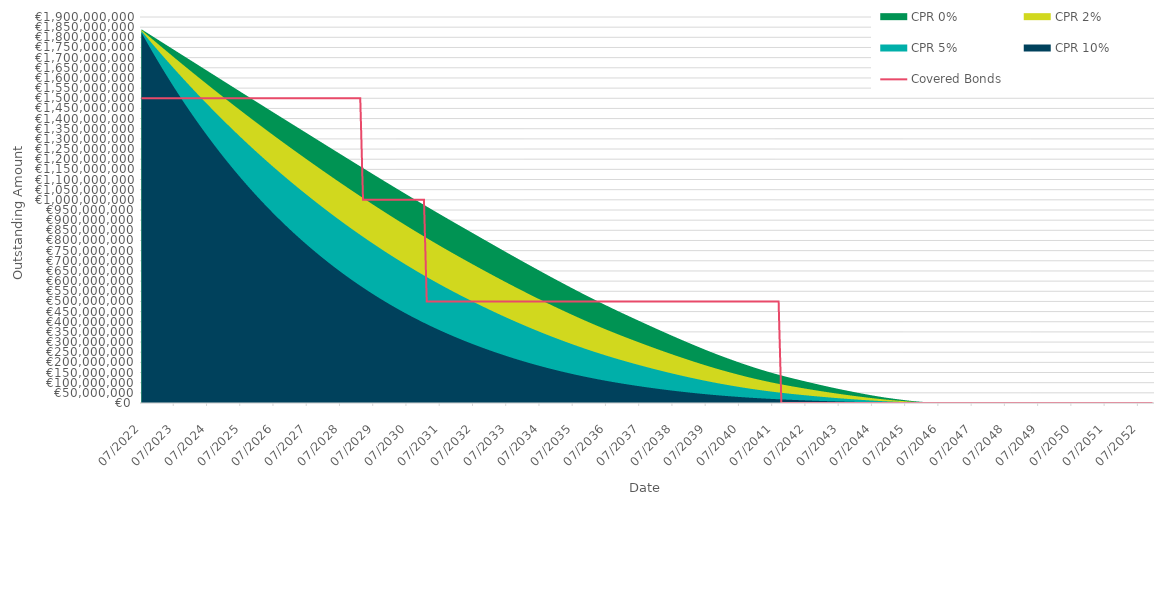
| Category | Covered Bonds |
|---|---|
| 2022-07-31 | 1500000000 |
| 2022-08-31 | 1500000000 |
| 2022-09-30 | 1500000000 |
| 2022-10-31 | 1500000000 |
| 2022-11-30 | 1500000000 |
| 2022-12-31 | 1500000000 |
| 2023-01-31 | 1500000000 |
| 2023-02-28 | 1500000000 |
| 2023-03-31 | 1500000000 |
| 2023-04-30 | 1500000000 |
| 2023-05-31 | 1500000000 |
| 2023-06-30 | 1500000000 |
| 2023-07-31 | 1500000000 |
| 2023-08-31 | 1500000000 |
| 2023-09-30 | 1500000000 |
| 2023-10-31 | 1500000000 |
| 2023-11-30 | 1500000000 |
| 2023-12-31 | 1500000000 |
| 2024-01-31 | 1500000000 |
| 2024-02-29 | 1500000000 |
| 2024-03-31 | 1500000000 |
| 2024-04-30 | 1500000000 |
| 2024-05-31 | 1500000000 |
| 2024-06-30 | 1500000000 |
| 2024-07-31 | 1500000000 |
| 2024-08-31 | 1500000000 |
| 2024-09-30 | 1500000000 |
| 2024-10-31 | 1500000000 |
| 2024-11-30 | 1500000000 |
| 2024-12-31 | 1500000000 |
| 2025-01-31 | 1500000000 |
| 2025-02-28 | 1500000000 |
| 2025-03-31 | 1500000000 |
| 2025-04-30 | 1500000000 |
| 2025-05-31 | 1500000000 |
| 2025-06-30 | 1500000000 |
| 2025-07-31 | 1500000000 |
| 2025-08-31 | 1500000000 |
| 2025-09-30 | 1500000000 |
| 2025-10-31 | 1500000000 |
| 2025-11-30 | 1500000000 |
| 2025-12-31 | 1500000000 |
| 2026-01-31 | 1500000000 |
| 2026-02-28 | 1500000000 |
| 2026-03-31 | 1500000000 |
| 2026-04-30 | 1500000000 |
| 2026-05-31 | 1500000000 |
| 2026-06-30 | 1500000000 |
| 2026-07-31 | 1500000000 |
| 2026-08-31 | 1500000000 |
| 2026-09-30 | 1500000000 |
| 2026-10-31 | 1500000000 |
| 2026-11-30 | 1500000000 |
| 2026-12-31 | 1500000000 |
| 2027-01-31 | 1500000000 |
| 2027-02-28 | 1500000000 |
| 2027-03-31 | 1500000000 |
| 2027-04-30 | 1500000000 |
| 2027-05-31 | 1500000000 |
| 2027-06-30 | 1500000000 |
| 2027-07-31 | 1500000000 |
| 2027-08-31 | 1500000000 |
| 2027-09-30 | 1500000000 |
| 2027-10-31 | 1500000000 |
| 2027-11-30 | 1500000000 |
| 2027-12-31 | 1500000000 |
| 2028-01-31 | 1500000000 |
| 2028-02-29 | 1500000000 |
| 2028-03-31 | 1500000000 |
| 2028-04-30 | 1500000000 |
| 2028-05-31 | 1500000000 |
| 2028-06-30 | 1500000000 |
| 2028-07-31 | 1500000000 |
| 2028-08-31 | 1500000000 |
| 2028-09-30 | 1500000000 |
| 2028-10-31 | 1500000000 |
| 2028-11-30 | 1500000000 |
| 2028-12-31 | 1500000000 |
| 2029-01-31 | 1500000000 |
| 2029-02-28 | 1500000000 |
| 2029-03-31 | 1000000000 |
| 2029-04-30 | 1000000000 |
| 2029-05-31 | 1000000000 |
| 2029-06-30 | 1000000000 |
| 2029-07-31 | 1000000000 |
| 2029-08-31 | 1000000000 |
| 2029-09-30 | 1000000000 |
| 2029-10-31 | 1000000000 |
| 2029-11-30 | 1000000000 |
| 2029-12-31 | 1000000000 |
| 2030-01-31 | 1000000000 |
| 2030-02-28 | 1000000000 |
| 2030-03-31 | 1000000000 |
| 2030-04-30 | 1000000000 |
| 2030-05-31 | 1000000000 |
| 2030-06-30 | 1000000000 |
| 2030-07-31 | 1000000000 |
| 2030-08-31 | 1000000000 |
| 2030-09-30 | 1000000000 |
| 2030-10-31 | 1000000000 |
| 2030-11-30 | 1000000000 |
| 2030-12-31 | 1000000000 |
| 2031-01-31 | 1000000000 |
| 2031-02-28 | 500000000 |
| 2031-03-31 | 500000000 |
| 2031-04-30 | 500000000 |
| 2031-05-31 | 500000000 |
| 2031-06-30 | 500000000 |
| 2031-07-31 | 500000000 |
| 2031-08-31 | 500000000 |
| 2031-09-30 | 500000000 |
| 2031-10-31 | 500000000 |
| 2031-11-30 | 500000000 |
| 2031-12-31 | 500000000 |
| 2032-01-31 | 500000000 |
| 2032-02-29 | 500000000 |
| 2032-03-31 | 500000000 |
| 2032-04-30 | 500000000 |
| 2032-05-31 | 500000000 |
| 2032-06-30 | 500000000 |
| 2032-07-31 | 500000000 |
| 2032-08-31 | 500000000 |
| 2032-09-30 | 500000000 |
| 2032-10-31 | 500000000 |
| 2032-11-30 | 500000000 |
| 2032-12-31 | 500000000 |
| 2033-01-31 | 500000000 |
| 2033-02-28 | 500000000 |
| 2033-03-31 | 500000000 |
| 2033-04-30 | 500000000 |
| 2033-05-31 | 500000000 |
| 2033-06-30 | 500000000 |
| 2033-07-31 | 500000000 |
| 2033-08-31 | 500000000 |
| 2033-09-30 | 500000000 |
| 2033-10-31 | 500000000 |
| 2033-11-30 | 500000000 |
| 2033-12-31 | 500000000 |
| 2034-01-31 | 500000000 |
| 2034-02-28 | 500000000 |
| 2034-03-31 | 500000000 |
| 2034-04-30 | 500000000 |
| 2034-05-31 | 500000000 |
| 2034-06-30 | 500000000 |
| 2034-07-31 | 500000000 |
| 2034-08-31 | 500000000 |
| 2034-09-30 | 500000000 |
| 2034-10-31 | 500000000 |
| 2034-11-30 | 500000000 |
| 2034-12-31 | 500000000 |
| 2035-01-31 | 500000000 |
| 2035-02-28 | 500000000 |
| 2035-03-31 | 500000000 |
| 2035-04-30 | 500000000 |
| 2035-05-31 | 500000000 |
| 2035-06-30 | 500000000 |
| 2035-07-31 | 500000000 |
| 2035-08-31 | 500000000 |
| 2035-09-30 | 500000000 |
| 2035-10-31 | 500000000 |
| 2035-11-30 | 500000000 |
| 2035-12-31 | 500000000 |
| 2036-01-31 | 500000000 |
| 2036-02-29 | 500000000 |
| 2036-03-31 | 500000000 |
| 2036-04-30 | 500000000 |
| 2036-05-31 | 500000000 |
| 2036-06-30 | 500000000 |
| 2036-07-31 | 500000000 |
| 2036-08-31 | 500000000 |
| 2036-09-30 | 500000000 |
| 2036-10-31 | 500000000 |
| 2036-11-30 | 500000000 |
| 2036-12-31 | 500000000 |
| 2037-01-31 | 500000000 |
| 2037-02-28 | 500000000 |
| 2037-03-31 | 500000000 |
| 2037-04-30 | 500000000 |
| 2037-05-31 | 500000000 |
| 2037-06-30 | 500000000 |
| 2037-07-31 | 500000000 |
| 2037-08-31 | 500000000 |
| 2037-09-30 | 500000000 |
| 2037-10-31 | 500000000 |
| 2037-11-30 | 500000000 |
| 2037-12-31 | 500000000 |
| 2038-01-31 | 500000000 |
| 2038-02-28 | 500000000 |
| 2038-03-31 | 500000000 |
| 2038-04-30 | 500000000 |
| 2038-05-31 | 500000000 |
| 2038-06-30 | 500000000 |
| 2038-07-31 | 500000000 |
| 2038-08-31 | 500000000 |
| 2038-09-30 | 500000000 |
| 2038-10-31 | 500000000 |
| 2038-11-30 | 500000000 |
| 2038-12-31 | 500000000 |
| 2039-01-31 | 500000000 |
| 2039-02-28 | 500000000 |
| 2039-03-31 | 500000000 |
| 2039-04-30 | 500000000 |
| 2039-05-31 | 500000000 |
| 2039-06-30 | 500000000 |
| 2039-07-31 | 500000000 |
| 2039-08-31 | 500000000 |
| 2039-09-30 | 500000000 |
| 2039-10-31 | 500000000 |
| 2039-11-30 | 500000000 |
| 2039-12-31 | 500000000 |
| 2040-01-31 | 500000000 |
| 2040-02-29 | 500000000 |
| 2040-03-31 | 500000000 |
| 2040-04-30 | 500000000 |
| 2040-05-31 | 500000000 |
| 2040-06-30 | 500000000 |
| 2040-07-31 | 500000000 |
| 2040-08-31 | 500000000 |
| 2040-09-30 | 500000000 |
| 2040-10-31 | 500000000 |
| 2040-11-30 | 500000000 |
| 2040-12-31 | 500000000 |
| 2041-01-31 | 500000000 |
| 2041-02-28 | 500000000 |
| 2041-03-31 | 500000000 |
| 2041-04-30 | 500000000 |
| 2041-05-31 | 500000000 |
| 2041-06-30 | 500000000 |
| 2041-07-31 | 500000000 |
| 2041-08-31 | 500000000 |
| 2041-09-30 | 500000000 |
| 2041-10-31 | 0 |
| 2041-11-30 | 0 |
| 2041-12-31 | 0 |
| 2042-01-31 | 0 |
| 2042-02-28 | 0 |
| 2042-03-31 | 0 |
| 2042-04-30 | 0 |
| 2042-05-31 | 0 |
| 2042-06-30 | 0 |
| 2042-07-31 | 0 |
| 2042-08-31 | 0 |
| 2042-09-30 | 0 |
| 2042-10-31 | 0 |
| 2042-11-30 | 0 |
| 2042-12-31 | 0 |
| 2043-01-31 | 0 |
| 2043-02-28 | 0 |
| 2043-03-31 | 0 |
| 2043-04-30 | 0 |
| 2043-05-31 | 0 |
| 2043-06-30 | 0 |
| 2043-07-31 | 0 |
| 2043-08-31 | 0 |
| 2043-09-30 | 0 |
| 2043-10-31 | 0 |
| 2043-11-30 | 0 |
| 2043-12-31 | 0 |
| 2044-01-31 | 0 |
| 2044-02-29 | 0 |
| 2044-03-31 | 0 |
| 2044-04-30 | 0 |
| 2044-05-31 | 0 |
| 2044-06-30 | 0 |
| 2044-07-31 | 0 |
| 2044-08-31 | 0 |
| 2044-09-30 | 0 |
| 2044-10-31 | 0 |
| 2044-11-30 | 0 |
| 2044-12-31 | 0 |
| 2045-01-31 | 0 |
| 2045-02-28 | 0 |
| 2045-03-31 | 0 |
| 2045-04-30 | 0 |
| 2045-05-31 | 0 |
| 2045-06-30 | 0 |
| 2045-07-31 | 0 |
| 2045-08-31 | 0 |
| 2045-09-30 | 0 |
| 2045-10-31 | 0 |
| 2045-11-30 | 0 |
| 2045-12-31 | 0 |
| 2046-01-31 | 0 |
| 2046-02-28 | 0 |
| 2046-03-31 | 0 |
| 2046-04-30 | 0 |
| 2046-05-31 | 0 |
| 2046-06-30 | 0 |
| 2046-07-31 | 0 |
| 2046-08-31 | 0 |
| 2046-09-30 | 0 |
| 2046-10-31 | 0 |
| 2046-11-30 | 0 |
| 2046-12-31 | 0 |
| 2047-01-31 | 0 |
| 2047-02-28 | 0 |
| 2047-03-31 | 0 |
| 2047-04-30 | 0 |
| 2047-05-31 | 0 |
| 2047-06-30 | 0 |
| 2047-07-31 | 0 |
| 2047-08-31 | 0 |
| 2047-09-30 | 0 |
| 2047-10-31 | 0 |
| 2047-11-30 | 0 |
| 2047-12-31 | 0 |
| 2048-01-31 | 0 |
| 2048-02-29 | 0 |
| 2048-03-31 | 0 |
| 2048-04-30 | 0 |
| 2048-05-31 | 0 |
| 2048-06-30 | 0 |
| 2048-07-31 | 0 |
| 2048-08-31 | 0 |
| 2048-09-30 | 0 |
| 2048-10-31 | 0 |
| 2048-11-30 | 0 |
| 2048-12-31 | 0 |
| 2049-01-31 | 0 |
| 2049-02-28 | 0 |
| 2049-03-31 | 0 |
| 2049-04-30 | 0 |
| 2049-05-31 | 0 |
| 2049-06-30 | 0 |
| 2049-07-31 | 0 |
| 2049-08-31 | 0 |
| 2049-09-30 | 0 |
| 2049-10-31 | 0 |
| 2049-11-30 | 0 |
| 2049-12-31 | 0 |
| 2050-01-31 | 0 |
| 2050-02-28 | 0 |
| 2050-03-31 | 0 |
| 2050-04-30 | 0 |
| 2050-05-31 | 0 |
| 2050-06-30 | 0 |
| 2050-07-31 | 0 |
| 2050-08-31 | 0 |
| 2050-09-30 | 0 |
| 2050-10-31 | 0 |
| 2050-11-30 | 0 |
| 2050-12-31 | 0 |
| 2051-01-31 | 0 |
| 2051-02-28 | 0 |
| 2051-03-31 | 0 |
| 2051-04-30 | 0 |
| 2051-05-31 | 0 |
| 2051-06-30 | 0 |
| 2051-07-31 | 0 |
| 2051-08-31 | 0 |
| 2051-09-30 | 0 |
| 2051-10-31 | 0 |
| 2051-11-30 | 0 |
| 2051-12-31 | 0 |
| 2052-01-31 | 0 |
| 2052-02-29 | 0 |
| 2052-03-31 | 0 |
| 2052-04-30 | 0 |
| 2052-05-31 | 0 |
| 2052-06-30 | 0 |
| 2052-07-31 | 0 |
| 2052-08-31 | 0 |
| 2052-09-30 | 0 |
| 2052-10-31 | 0 |
| 2052-11-30 | 0 |
| 2052-12-31 | 0 |